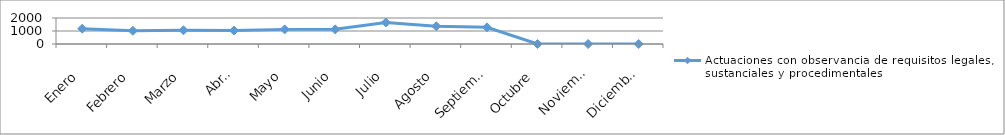
| Category | Actuaciones con observancia de requisitos legales, sustanciales y procedimentales |
|---|---|
| Enero | 1177 |
| Febrero | 1014 |
| Marzo | 1056 |
| Abril | 1038 |
| Mayo | 1125 |
| Junio | 1127 |
| Julio | 1656 |
| Agosto | 1362 |
| Septiembre | 1282 |
| Octubre | 0 |
| Noviembre | 0 |
| Diciembre | 0 |